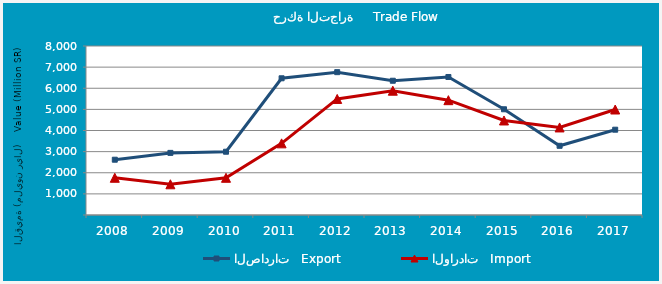
| Category | الصادرات   Export | الواردات   Import |
|---|---|---|
| 2008.0 | 2617451260 | 1762488145 |
| 2009.0 | 2940229885 | 1453409308 |
| 2010.0 | 2995222920 | 1761555959 |
| 2011.0 | 6471285372 | 3391882347 |
| 2012.0 | 6761591647 | 5493367318 |
| 2013.0 | 6355373125 | 5883363285 |
| 2014.0 | 6532768327 | 5435374641 |
| 2015.0 | 5004713901 | 4474251310 |
| 2016.0 | 3275427329 | 4144484740 |
| 2017.0 | 4038036240 | 4993645464 |